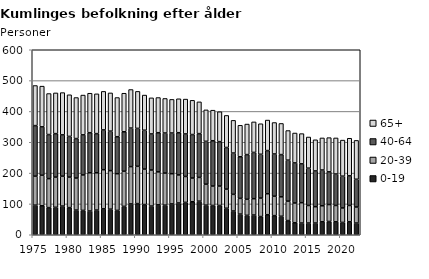
| Category | 0-19 | 20-39 | 40-64 | 65+ |
|---|---|---|---|---|
| 1975.0 | 96 | 94 | 164 | 130 |
| 1976.0 | 94 | 99 | 157 | 132 |
| 1977.0 | 88 | 94 | 143 | 133 |
| 1978.0 | 89 | 98 | 141 | 132 |
| 1979.0 | 93 | 97 | 134 | 137 |
| 1980.0 | 88 | 99 | 132 | 135 |
| 1981.0 | 80 | 104 | 128 | 133 |
| 1982.0 | 79 | 115 | 130 | 129 |
| 1983.0 | 77 | 124 | 130 | 128 |
| 1984.0 | 80 | 121 | 127 | 129 |
| 1985.0 | 84 | 127 | 129 | 125 |
| 1986.0 | 83 | 125 | 128 | 124 |
| 1987.0 | 79 | 119 | 120 | 127 |
| 1988.0 | 92 | 114 | 128 | 125 |
| 1989.0 | 100 | 121 | 125 | 125 |
| 1990.0 | 101 | 121 | 123 | 120 |
| 1991.0 | 98 | 115 | 126 | 114 |
| 1992.0 | 93 | 117 | 117 | 117 |
| 1993.0 | 97 | 107 | 127 | 114 |
| 1994.0 | 96 | 104 | 130 | 112 |
| 1995.0 | 100 | 98 | 132 | 109 |
| 1996.0 | 103 | 91 | 137 | 110 |
| 1997.0 | 105 | 84 | 138 | 113 |
| 1998.0 | 107 | 77 | 141 | 111 |
| 1999.0 | 109 | 77 | 142 | 103 |
| 2000.0 | 96 | 68 | 139 | 102 |
| 2001.0 | 95 | 63 | 147 | 99 |
| 2002.0 | 95 | 63 | 144 | 97 |
| 2003.0 | 86 | 62 | 135 | 104 |
| 2004.0 | 77 | 54 | 134 | 106 |
| 2005.0 | 67 | 51 | 135 | 102 |
| 2006.0 | 63 | 52 | 145 | 99 |
| 2007.0 | 64 | 53 | 150 | 99 |
| 2008.0 | 59 | 60 | 142 | 99 |
| 2009.0 | 65 | 68 | 140 | 99 |
| 2010.0 | 62 | 63 | 137 | 102 |
| 2011.0 | 60 | 63 | 137 | 101 |
| 2012.0 | 46 | 63 | 133 | 96 |
| 2013.0 | 39 | 64 | 130 | 97 |
| 2014.0 | 38 | 66 | 126 | 98 |
| 2015.0 | 38 | 57 | 121 | 101 |
| 2016.0 | 38 | 53 | 116 | 101 |
| 2017.0 | 42 | 52 | 116 | 104 |
| 2018.0 | 43 | 55 | 106 | 111 |
| 2019.0 | 42 | 53 | 102 | 117 |
| 2020.0 | 40 | 47 | 103 | 117 |
| 2021.0 | 42 | 53 | 96 | 122 |
| 2022.0 | 38 | 52 | 90 | 126 |